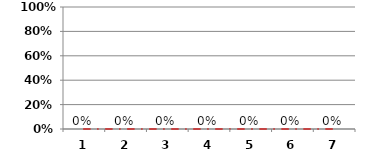
| Category | Series 0 |
|---|---|
| 0 | 0 |
| 1 | 0 |
| 2 | 0 |
| 3 | 0 |
| 4 | 0 |
| 5 | 0 |
| 6 | 0 |